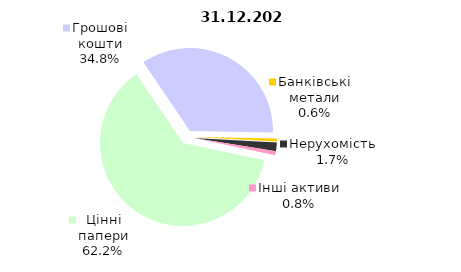
| Category | Всього |
|---|---|
| Цінні папери | 1196.182 |
| Грошові кошти | 669.471 |
| Банківські метали | 11.009 |
| Нерухомість | 32.274 |
| Інші активи | 15.233 |